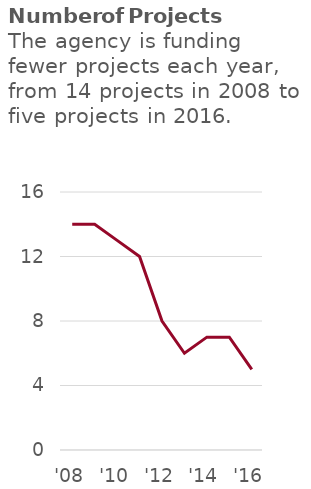
| Category | Number of Projects Funded |
|---|---|
| '08 | 14 |
| '09 | 14 |
| '10 | 13 |
| '11 | 12 |
| '12 | 8 |
| '13 | 6 |
| '14 | 7 |
| '15 | 7 |
| '16 | 5 |